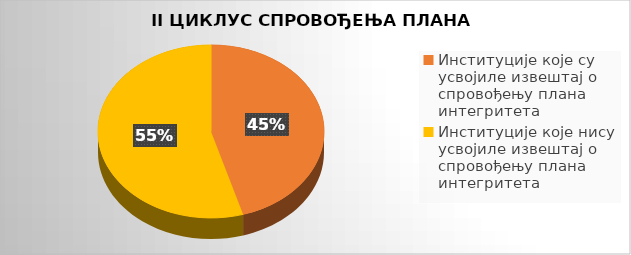
| Category | Series 0 |
|---|---|
| Институције које су усвојиле извештај о спровођењу плана интегритета | 0.454 |
| Институције које нису усвојиле извештај о спровођењу плана интегритета | 0.546 |